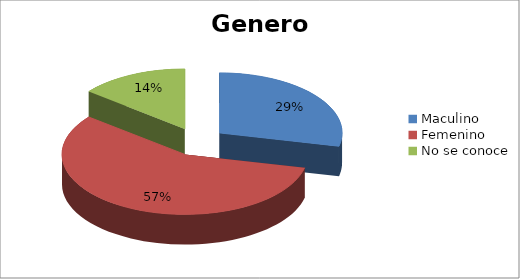
| Category | Cant. |
|---|---|
| Maculino | 4 |
| Femenino | 8 |
| No se conoce | 2 |